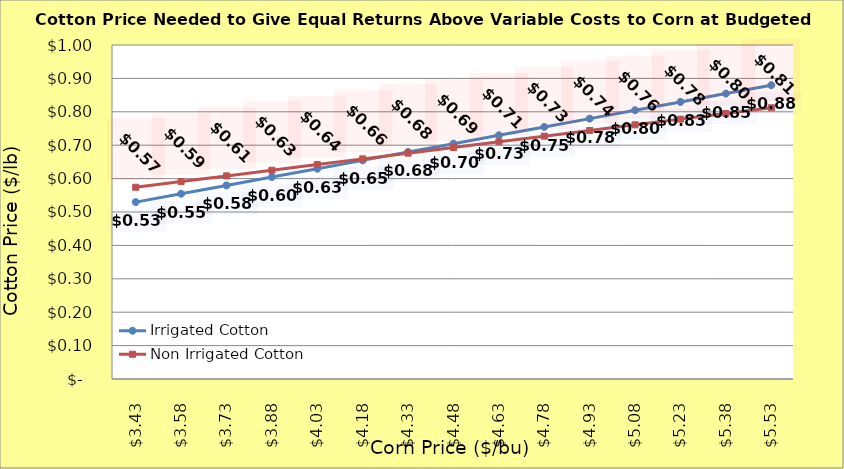
| Category | Irrigated Cotton | Non Irrigated Cotton |
|---|---|---|
| 3.4299999999999997 | 0.53 | 0.574 |
| 3.5799999999999996 | 0.555 | 0.591 |
| 3.7299999999999995 | 0.58 | 0.608 |
| 3.8799999999999994 | 0.605 | 0.625 |
| 4.029999999999999 | 0.63 | 0.642 |
| 4.18 | 0.655 | 0.659 |
| 4.33 | 0.68 | 0.676 |
| 4.48 | 0.705 | 0.693 |
| 4.630000000000001 | 0.73 | 0.71 |
| 4.780000000000001 | 0.755 | 0.727 |
| 4.9300000000000015 | 0.78 | 0.744 |
| 5.080000000000002 | 0.805 | 0.761 |
| 5.230000000000002 | 0.83 | 0.778 |
| 5.380000000000003 | 0.855 | 0.795 |
| 5.530000000000003 | 0.88 | 0.812 |